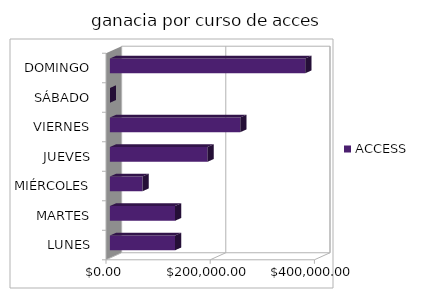
| Category | ACCESS |
|---|---|
| LUNES | 125000 |
| MARTES | 125000 |
| MIÉRCOLES | 62500 |
| JUEVES | 187500 |
| VIERNES | 250000 |
| SÁBADO | 0 |
| DOMINGO | 375000 |